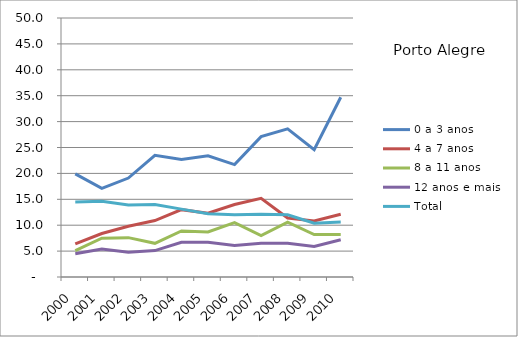
| Category | 0 a 3 anos | 4 a 7 anos | 8 a 11 anos | 12 anos e mais | Total |
|---|---|---|---|---|---|
| 2000.0 | 19.9 | 6.4 | 5.1 | 4.5 | 14.5 |
| 2001.0 | 17.1 | 8.4 | 7.5 | 5.4 | 14.6 |
| 2002.0 | 19.1 | 9.8 | 7.6 | 4.8 | 13.9 |
| 2003.0 | 23.5 | 10.9 | 6.5 | 5.1 | 14 |
| 2004.0 | 22.7 | 13 | 8.9 | 6.7 | 13.1 |
| 2005.0 | 23.4 | 12.3 | 8.7 | 6.7 | 12.2 |
| 2006.0 | 21.7 | 14 | 10.5 | 6.1 | 12 |
| 2007.0 | 27.1 | 15.2 | 8 | 6.5 | 12.1 |
| 2008.0 | 28.6 | 11.4 | 10.6 | 6.5 | 12 |
| 2009.0 | 24.6 | 10.8 | 8.2 | 5.9 | 10.4 |
| 2010.0 | 34.7 | 12.1 | 8.2 | 7.2 | 10.6 |